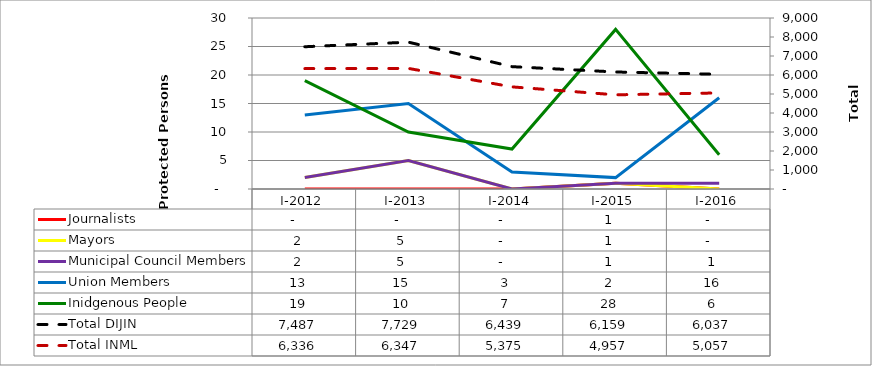
| Category | Journalists | Mayors | Municipal Council Members | Union Members | Inidgenous People |
|---|---|---|---|---|---|
| I-2012 | 0 | 2 | 2 | 13 | 19 |
| I-2013 | 0 | 5 | 5 | 15 | 10 |
| I-2014 | 0 | 0 | 0 | 3 | 7 |
| I-2015 | 1 | 1 | 1 | 2 | 28 |
| I-2016 | 0 | 0 | 1 | 16 | 6 |